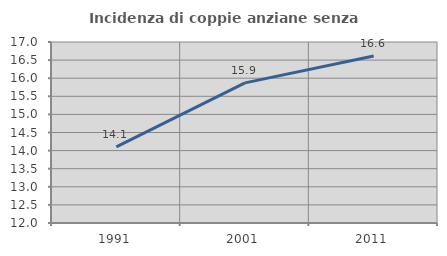
| Category | Incidenza di coppie anziane senza figli  |
|---|---|
| 1991.0 | 14.103 |
| 2001.0 | 15.87 |
| 2011.0 | 16.612 |